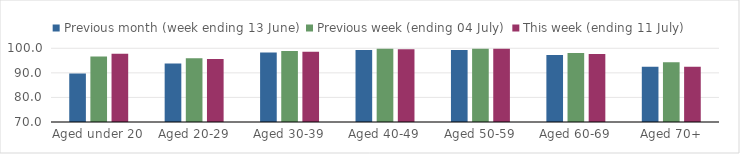
| Category | Previous month (week ending 13 June) | Previous week (ending 04 July) | This week (ending 11 July) |
|---|---|---|---|
| Aged under 20 | 89.736 | 96.687 | 97.745 |
| Aged 20-29 | 93.806 | 95.984 | 95.602 |
| Aged 30-39 | 98.273 | 98.931 | 98.584 |
| Aged 40-49 | 99.32 | 99.809 | 99.636 |
| Aged 50-59 | 99.309 | 99.817 | 99.814 |
| Aged 60-69 | 97.256 | 98.056 | 97.682 |
| Aged 70+ | 92.509 | 94.336 | 92.516 |